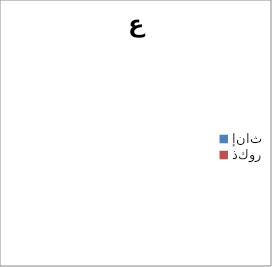
| Category | مجموع |
|---|---|
| إناث | 0 |
| ذكور | 0 |